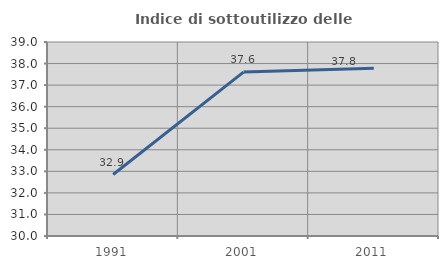
| Category | Indice di sottoutilizzo delle abitazioni  |
|---|---|
| 1991.0 | 32.851 |
| 2001.0 | 37.604 |
| 2011.0 | 37.785 |